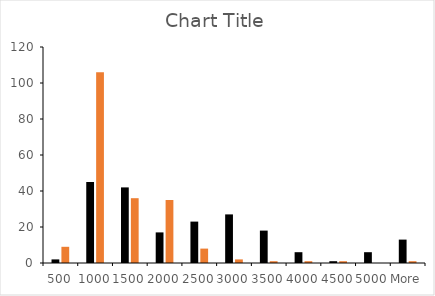
| Category | Series 0 | Series 1 |
|---|---|---|
| 500 | 2 | 9 |
| 1000 | 45 | 106 |
| 1500 | 42 | 36 |
| 2000 | 17 | 35 |
| 2500 | 23 | 8 |
| 3000 | 27 | 2 |
| 3500 | 18 | 1 |
| 4000 | 6 | 1 |
| 4500 | 1 | 1 |
| 5000 | 6 | 0 |
| More | 13 | 1 |